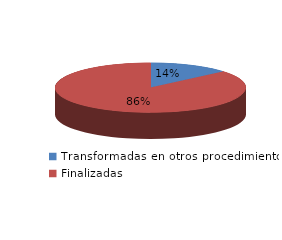
| Category | Series 0 |
|---|---|
| Transformadas en otros procedimientos | 951 |
| Finalizadas | 6006 |